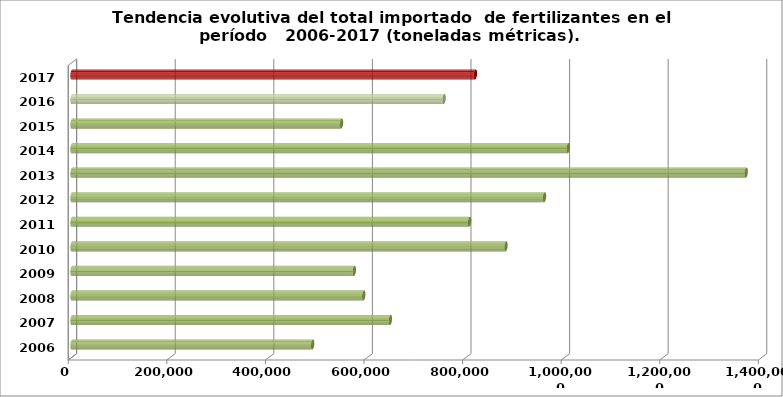
| Category | TOTAL (ton) |
|---|---|
| 2006.0 | 488147.22 |
| 2007.0 | 645864 |
| 2008.0 | 591889.821 |
| 2009.0 | 572710.431 |
| 2010.0 | 880367.04 |
| 2011.0 | 806468 |
| 2012.0 | 958500 |
| 2013.0 | 1367687 |
| 2014.0 | 1006722 |
| 2015.0 | 546691.271 |
| 2016.0 | 754806.933 |
| 2017.0 | 818342 |